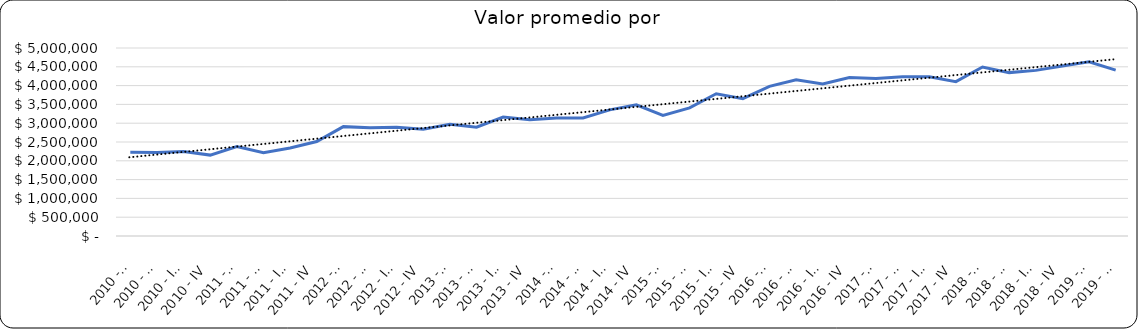
| Category | Valor m2 en Bogotá por sectores |
|---|---|
| 2010 - I | 2229885.057 |
| 2010 - II | 2222222.222 |
| 2010 - III | 2247126.437 |
| 2010 - IV | 2151340.996 |
| 2011 - I | 2380952.381 |
| 2011 - II | 2212301.587 |
| 2011 - III | 2341269.841 |
| 2011 - IV | 2511904.762 |
| 2012 - I | 2908730.159 |
| 2012 - II | 2876984.127 |
| 2012 - III | 2892857.143 |
| 2012 - IV | 2837301.587 |
| 2013 - I | 2969939.759 |
| 2013 - II | 2895582.329 |
| 2013 - III | 3162650.602 |
| 2013 - IV | 3092369.478 |
| 2014 - I | 3139534.884 |
| 2014 - II | 3139534.884 |
| 2014 - III | 3354069.767 |
| 2014 - IV | 3488372.093 |
| 2015 - I | 3205992.509 |
| 2015 - II | 3408239.7 |
| 2015 - III | 3782771.536 |
| 2015 - IV | 3651685.393 |
| 2016 - I | 3980392.157 |
| 2016 - II | 4157303.371 |
| 2016 - III | 4044715.447 |
| 2016 - IV | 4215686.275 |
| 2017 - I | 4189922.481 |
| 2017 - II | 4232283.465 |
| 2017 - III | 4237288.136 |
| 2017 - IV | 4105058.366 |
| 2018 - I | 4493750 |
| 2018 - II | 4345238.095 |
| 2018 - III | 4404762 |
| 2018 - IV | 4523810 |
| 2019 - I | 4634146 |
| 2019 - II | 4411111 |